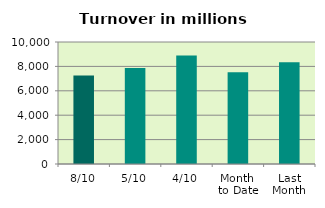
| Category | Series 0 |
|---|---|
| 8/10 | 7247.353 |
| 5/10 | 7879.017 |
| 4/10 | 8891.576 |
| Month 
to Date | 7526.96 |
| Last
Month | 8346.546 |